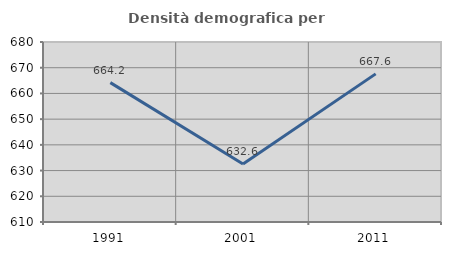
| Category | Densità demografica |
|---|---|
| 1991.0 | 664.196 |
| 2001.0 | 632.562 |
| 2011.0 | 667.605 |